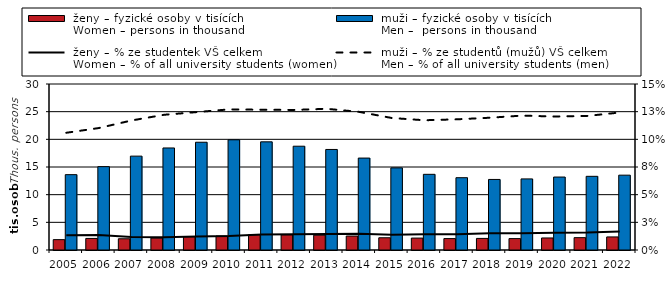
| Category |  ženy – fyzické osoby v tisících
 Women – persons in thousand |  muži – fyzické osoby v tisících
 Men –  persons in thousand |
|---|---|---|
| 2005.0 | 1.875 | 13.617 |
| 2006.0 | 2.092 | 15.067 |
| 2007.0 | 2.032 | 16.963 |
| 2008.0 | 2.153 | 18.442 |
| 2009.0 | 2.418 | 19.473 |
| 2010.0 | 2.533 | 19.918 |
| 2011.0 | 2.767 | 19.547 |
| 2012.0 | 2.737 | 18.756 |
| 2013.0 | 2.677 | 18.17 |
| 2014.0 | 2.526 | 16.615 |
| 2015.0 | 2.213 | 14.843 |
| 2016.0 | 2.152 | 13.676 |
| 2017.0 | 2.063 | 13.067 |
| 2018.0 | 2.094 | 12.751 |
| 2019.0 | 2.059 | 12.851 |
| 2020.0 | 2.176 | 13.185 |
| 2021.0 | 2.231 | 13.315 |
| 2022.0 | 2.362 | 13.525 |